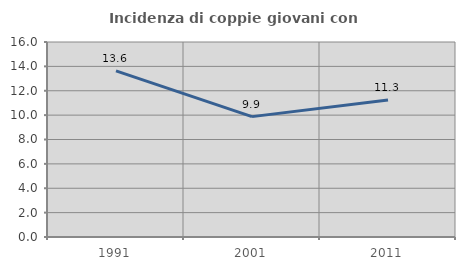
| Category | Incidenza di coppie giovani con figli |
|---|---|
| 1991.0 | 13.636 |
| 2001.0 | 9.877 |
| 2011.0 | 11.25 |